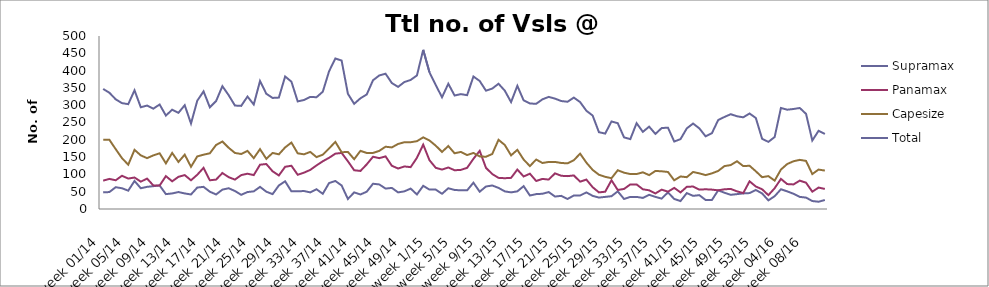
| Category | Supramax | Panamax | Capesize | Total |
|---|---|---|---|---|
| week 01/14 | 48 | 82 | 200 | 347 |
| week 02/14 | 49 | 87 | 200 | 336 |
| week 03/14 | 63 | 83 | 173 | 317 |
| week 04/14 | 60 | 96 | 147 | 306 |
| week 05/14 | 53 | 88 | 128 | 303 |
| week 06/14 | 81 | 91 | 171 | 343 |
| week 07/14 | 60 | 79 | 155 | 294 |
| week 08/14 | 64 | 88 | 147 | 299 |
| week 09/14 | 66 | 68 | 155 | 290 |
| week 10/14 | 68 | 68 | 161 | 302 |
| week 11/14 | 43 | 95 | 132 | 270 |
| week 12/14 | 45 | 80 | 162 | 287 |
| week 13/14 | 49 | 93 | 136 | 278 |
| week 14/14 | 45 | 98 | 157 | 300 |
| week 15/14 | 42 | 83 | 122 | 247 |
| week 16/14 | 62 | 99 | 152 | 313 |
| week 17/14 | 64 | 119 | 157 | 340 |
| week 18/14 | 50 | 83 | 161 | 294 |
| week 19/14 | 42 | 85 | 185 | 312 |
| week 20/14 | 56 | 104 | 195 | 355 |
| week 21/14 | 60 | 92 | 177 | 329 |
| week 22/14 | 52 | 85 | 162 | 299 |
| week 23/14 | 41 | 98 | 159 | 298 |
| week 24/14 | 49 | 102 | 168 | 325 |
| week 25/14 | 51 | 98 | 147 | 302 |
| week 26/14 | 64 | 128 | 173 | 370 |
| week 27/14 | 50 | 130 | 145 | 333 |
| week 28/14 | 43 | 109 | 162 | 321 |
| week 29/14 | 68 | 97 | 158 | 322 |
| week 30/14 | 80 | 122 | 178 | 383 |
| week 31/14 | 51 | 125 | 192 | 368 |
| week 32/14 | 51 | 99 | 161 | 311 |
| week 33/14 | 52 | 105 | 158 | 315 |
| week 34/14 | 48 | 113 | 165 | 324 |
| week 35/14 | 57 | 126 | 150 | 323 |
| week 36/14 | 44 | 138 | 157 | 339 |
| week 37/14 | 75 | 148 | 175 | 398 |
| week 38/14 | 81 | 160 | 194 | 435 |
| week 39/14 | 68 | 162 | 164 | 429 |
| week 40/14 | 29 | 138 | 165 | 333 |
| week 41/14 | 48 | 112 | 144 | 304 |
| week 42/14 | 42 | 110 | 168 | 320 |
| week 43/14 | 50 | 129 | 162 | 331 |
| week 44/14 | 73 | 151 | 162 | 372 |
| week 45/14 | 71 | 147 | 168 | 386 |
| week 46/14 | 59 | 152 | 180 | 391 |
| week 47/14 | 61 | 125 | 178 | 364 |
| week 48/14 | 48 | 117 | 188 | 353 |
| week 49/14 | 51 | 123 | 193 | 367 |
| week 50/14 | 59 | 121 | 193 | 373 |
| week 51/14 | 42 | 148 | 196 | 386 |
| week 52/14 | 67 | 186 | 207 | 460 |
| week 1/15 | 56 | 141 | 198 | 395 |
| week 2/15 | 56 | 119 | 183 | 358 |
| week 3/15 | 44 | 114 | 165 | 323 |
| week 4/15 | 60 | 120 | 182 | 362 |
| week 5/15 | 55 | 112 | 161 | 328 |
| week 6/15 | 54 | 113 | 165 | 332 |
| week 7/15 | 54 | 119 | 156 | 329 |
| week 8/15 | 76 | 145 | 162 | 383 |
| week 9/15 | 50 | 168 | 152 | 370 |
| week 10/15 | 65 | 119 | 151 | 342 |
| week 11/15 | 68 | 101 | 159 | 348 |
| week 12/15 | 61 | 90 | 200 | 362 |
| week 13/15 | 51 | 89 | 185 | 342 |
| week 14/15 | 48 | 90 | 155 | 309 |
| week 15/15 | 51 | 114 | 171 | 356 |
| week 16/15 | 66 | 94 | 143 | 314 |
| week 17/15 | 39 | 102 | 124 | 305 |
| week 18/15 | 43 | 81 | 143 | 304 |
| week 19/15 | 44 | 87 | 133 | 317 |
| week 20/15 | 49 | 85 | 136 | 324 |
| week 21/15 | 36 | 103 | 136 | 319 |
| week 22/15 | 38 | 96 | 133 | 312 |
| week 23/15 | 29 | 95 | 132 | 310 |
| week 24/15 | 39 | 97 | 141 | 322 |
| week 25/15 | 39 | 79 | 160 | 309 |
| week 26/15 | 48 | 85 | 134 | 284 |
| week 27/15 | 38 | 63 | 113 | 270 |
| week 28/15 | 33 | 48 | 99 | 222 |
| week 29/15 | 35 | 50 | 93 | 218 |
| week 30/15 | 37 | 83 | 89 | 253 |
| week 31/15 | 51 | 55 | 112 | 248 |
| week 32/15 | 29 | 58 | 105 | 207 |
| week 33/15 | 35 | 71 | 101 | 202 |
| week 34/15 | 35 | 71 | 101 | 248 |
| week 35/15 | 32 | 57 | 106 | 223 |
| week 36/15 | 41 | 54 | 98 | 238 |
| week 37/15 | 35 | 45 | 110 | 217 |
| week 38/15 | 30 | 56 | 109 | 234 |
| week 39/15 | 48 | 50 | 107 | 235 |
| week 40/15 | 29 | 61 | 83 | 195 |
| week 41/15 | 23 | 48 | 94 | 202 |
| week 42/15 | 46 | 64 | 92 | 233 |
| week 43/15 | 38 | 65 | 107 | 247 |
| week 44/15 | 40 | 56 | 103 | 233 |
| week 45/15 | 26 | 57 | 98 | 210 |
| week 46/15 | 26 | 56 | 103 | 219 |
| week 47/15 | 54 | 54 | 110 | 257 |
| week 48/15 | 47 | 57 | 124 | 266 |
| week 49/15 | 41 | 58 | 127 | 274 |
| week 50/15 | 43 | 51 | 138 | 268 |
| week 51/15 | 45 | 46 | 124 | 265 |
| week 52/15 | 46 | 80 | 125 | 276 |
| week 53/15 | 55 | 65 | 109 | 263 |
| week 01/16 | 45 | 57 | 92 | 203 |
| week 02/16 | 25 | 40 | 95 | 194 |
| week 03/16 | 37 | 60 | 82 | 208 |
| week 04/16 | 57 | 87 | 114 | 292 |
| week 05/16 | 51 | 72 | 130 | 287 |
| week 06/16 | 44 | 71 | 138 | 289 |
| week 07/16 | 35 | 82 | 142 | 292 |
| week 08/16 | 33 | 76 | 139 | 275 |
| week 09/16 | 23 | 50 | 101 | 198 |
| week 10/16 | 21 | 62 | 114 | 226 |
| week 11/16 | 26 | 58 | 111 | 217 |